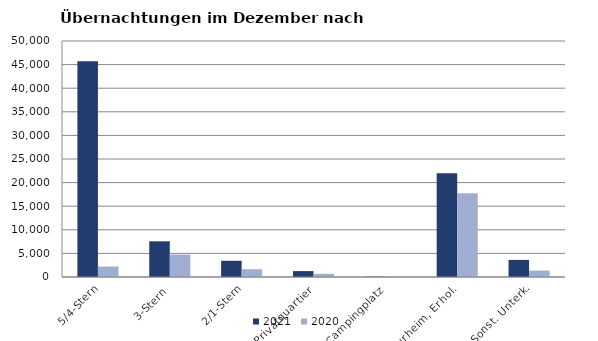
| Category | 2021 | 2020 |
|---|---|---|
| 5/4-Stern | 45719 | 2220 |
| 3-Stern | 7563 | 4747 |
| 2/1-Stern | 3439 | 1647 |
| Privatquartier | 1248 | 673 |
| Campingplatz | 63 | 0 |
| Kurheim, Erhol. | 22005 | 17726 |
| Sonst. Unterk. | 3624 | 1365 |